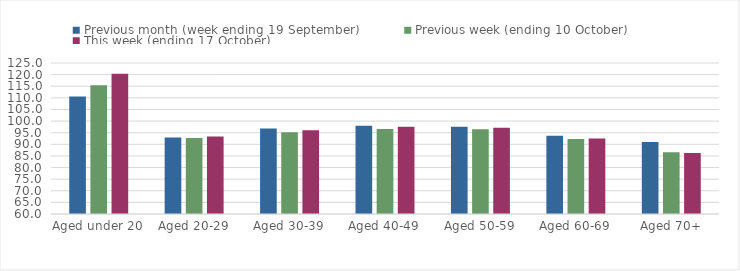
| Category | Previous month (week ending 19 September) | Previous week (ending 10 October) | This week (ending 17 October) |
|---|---|---|---|
| Aged under 20 | 110.55 | 115.43 | 120.41 |
| Aged 20-29 | 92.94 | 92.71 | 93.36 |
| Aged 30-39 | 96.83 | 95.21 | 96.03 |
| Aged 40-49 | 98.01 | 96.59 | 97.51 |
| Aged 50-59 | 97.57 | 96.53 | 97.17 |
| Aged 60-69 | 93.65 | 92.24 | 92.49 |
| Aged 70+ | 90.94 | 86.57 | 86.25 |